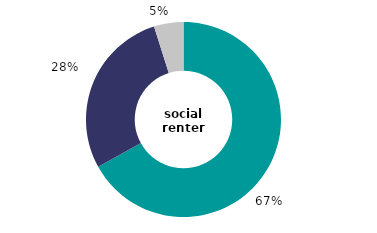
| Category | social renters |
|---|---|
| complaint not considered | 66.959 |
| complaint made | 28.152 |
| no complaint made | 4.889 |